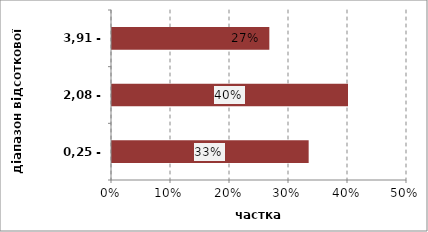
| Category | Series 0 |
|---|---|
| 0,25 - 2,08 | 0.333 |
| 2,08 - 3,91 | 0.4 |
| 3,91 - 5,75 | 0.267 |